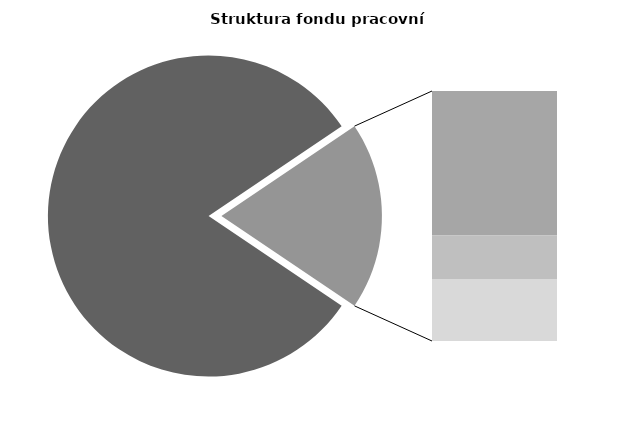
| Category | Series 0 |
|---|---|
| Průměrná měsíční odpracovaná doba bez přesčasu | 138.752 |
| Dovolená | 18.714 |
| Nemoc | 5.617 |
| Jiné | 8.022 |